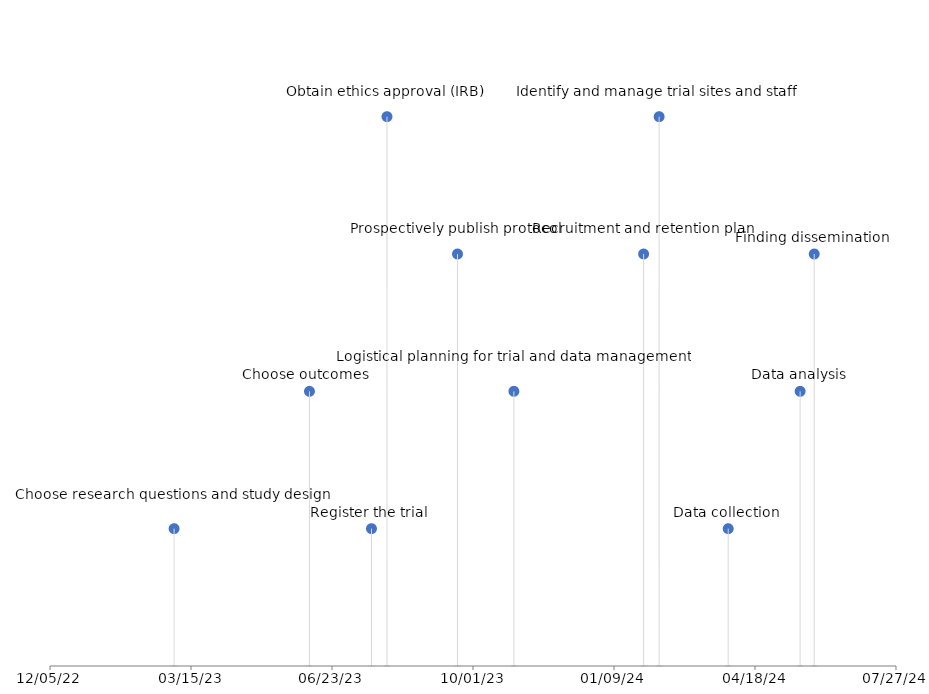
| Category | 03/03/23 |
|---|---|
| 44988.0 | 1 |
| 45084.0 | 2 |
| 45128.0 | 1 |
| 45139.0 | 4 |
| 45189.0 | 3 |
| 45229.0 | 2 |
| 45321.0 | 3 |
| 45332.0 | 4 |
| 45381.0 | 1 |
| 45432.0 | 2 |
| 45442.0 | 3 |